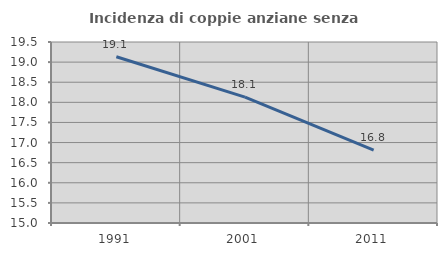
| Category | Incidenza di coppie anziane senza figli  |
|---|---|
| 1991.0 | 19.133 |
| 2001.0 | 18.131 |
| 2011.0 | 16.812 |